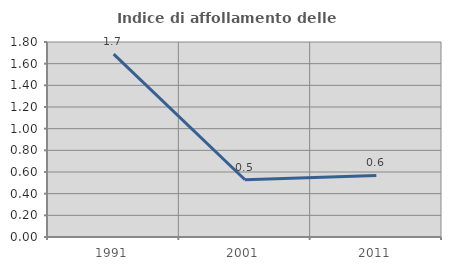
| Category | Indice di affollamento delle abitazioni  |
|---|---|
| 1991.0 | 1.689 |
| 2001.0 | 0.529 |
| 2011.0 | 0.568 |